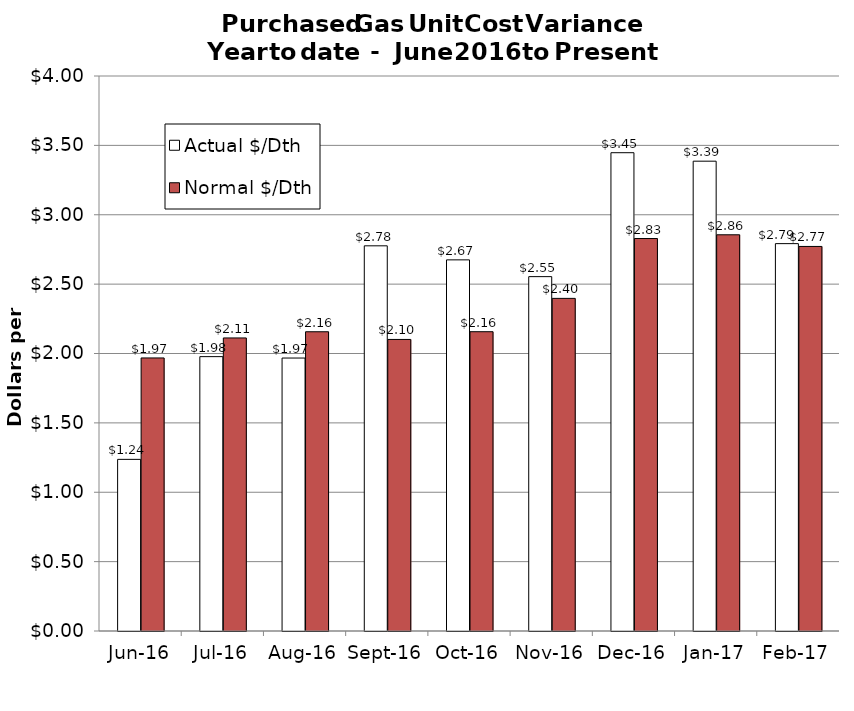
| Category | Actual $/Dth | Normal $/Dth |
|---|---|---|
| 2016-06-01 | 1.237 | 1.968 |
| 2016-07-01 | 1.977 | 2.112 |
| 2016-08-01 | 1.967 | 2.157 |
| 2016-09-01 | 2.776 | 2.101 |
| 2016-10-01 | 2.675 | 2.157 |
| 2016-11-01 | 2.554 | 2.397 |
| 2016-12-01 | 3.447 | 2.829 |
| 2017-01-01 | 3.386 | 2.856 |
| 2017-02-01 | 2.792 | 2.772 |